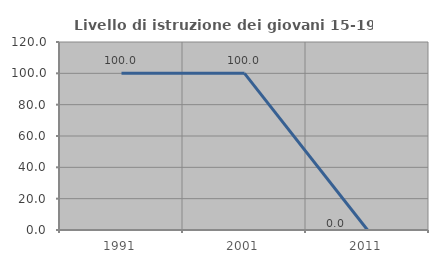
| Category | Livello di istruzione dei giovani 15-19 anni |
|---|---|
| 1991.0 | 100 |
| 2001.0 | 100 |
| 2011.0 | 0 |